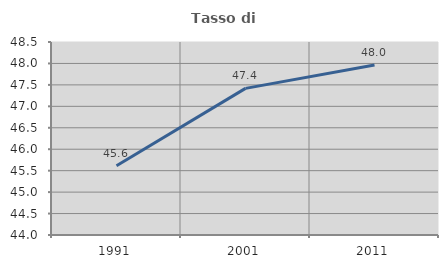
| Category | Tasso di occupazione   |
|---|---|
| 1991.0 | 45.614 |
| 2001.0 | 47.419 |
| 2011.0 | 47.963 |